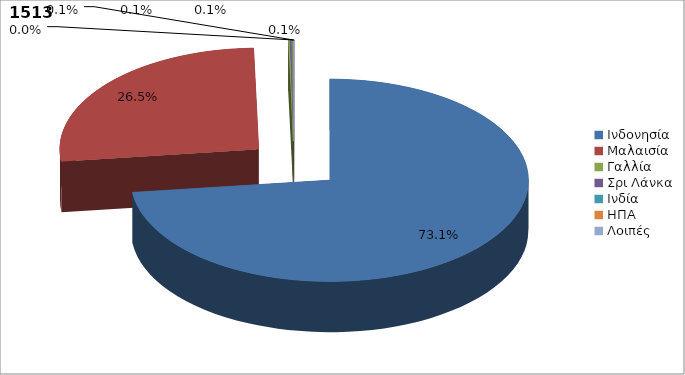
| Category | Series 0 |
|---|---|
| Ινδονησία | 0.731 |
| Μαλαισία | 0.265 |
| Γαλλία | 0.001 |
| Σρι Λάνκα | 0.001 |
| Ινδία | 0.001 |
| ΗΠΑ | 0.001 |
| Λοιπές | 0 |